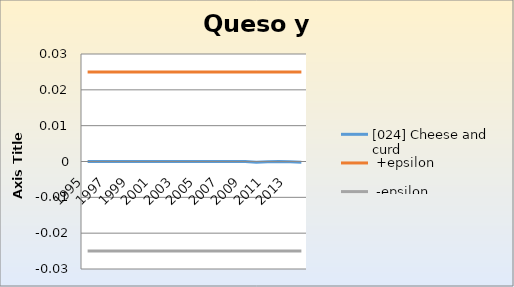
| Category | [024] Cheese and curd |  +epsilon |  -epsilon |
|---|---|---|---|
| 1995.0 | 0 | 0.025 | -0.025 |
| 1996.0 | 0 | 0.025 | -0.025 |
| 1997.0 | 0 | 0.025 | -0.025 |
| 1998.0 | 0 | 0.025 | -0.025 |
| 1999.0 | 0 | 0.025 | -0.025 |
| 2000.0 | 0 | 0.025 | -0.025 |
| 2001.0 | 0 | 0.025 | -0.025 |
| 2002.0 | 0 | 0.025 | -0.025 |
| 2003.0 | 0 | 0.025 | -0.025 |
| 2004.0 | 0 | 0.025 | -0.025 |
| 2005.0 | 0 | 0.025 | -0.025 |
| 2006.0 | 0 | 0.025 | -0.025 |
| 2007.0 | 0 | 0.025 | -0.025 |
| 2008.0 | 0 | 0.025 | -0.025 |
| 2009.0 | 0 | 0.025 | -0.025 |
| 2010.0 | 0 | 0.025 | -0.025 |
| 2011.0 | 0 | 0.025 | -0.025 |
| 2012.0 | 0 | 0.025 | -0.025 |
| 2013.0 | 0 | 0.025 | -0.025 |
| 2014.0 | 0 | 0.025 | -0.025 |